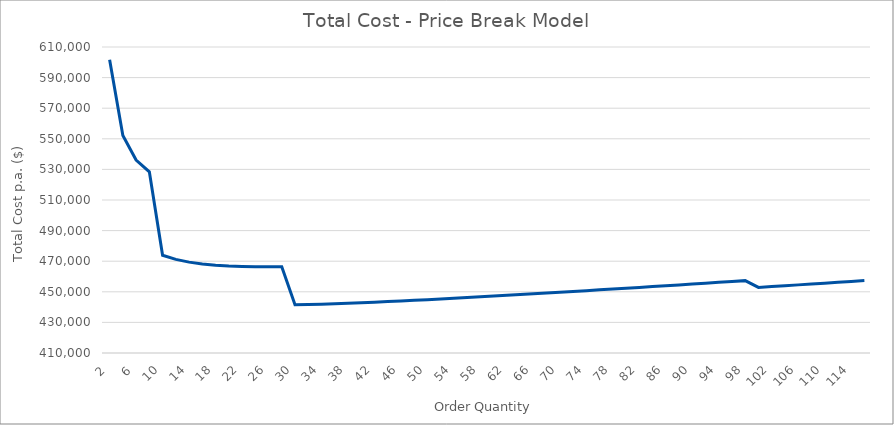
| Category | Series 0 |
|---|---|
| 2.0 | 601600 |
| 4.0 | 552200 |
| 6.0 | 536133.333 |
| 8.0 | 528400 |
| 10.0 | 473900 |
| 12.0 | 471166.667 |
| 14.0 | 469385.714 |
| 16.0 | 468200 |
| 18.0 | 467411.111 |
| 20.0 | 466900 |
| 22.0 | 466590.909 |
| 24.0 | 466433.333 |
| 26.0 | 466392.308 |
| 28.0 | 466442.857 |
| 30.0 | 441516.667 |
| 32.0 | 441700 |
| 34.0 | 441932.353 |
| 36.0 | 442205.556 |
| 38.0 | 442513.158 |
| 40.0 | 442850 |
| 42.0 | 443211.905 |
| 44.0 | 443595.455 |
| 46.0 | 443997.826 |
| 48.0 | 444416.667 |
| 50.0 | 444850 |
| 52.0 | 445296.154 |
| 54.0 | 445753.704 |
| 56.0 | 446221.429 |
| 58.0 | 446698.276 |
| 60.0 | 447183.333 |
| 62.0 | 447675.806 |
| 64.0 | 448175 |
| 66.0 | 448680.303 |
| 68.0 | 449191.176 |
| 70.0 | 449707.143 |
| 72.0 | 450227.778 |
| 74.0 | 450752.703 |
| 76.0 | 451281.579 |
| 78.0 | 451814.103 |
| 80.0 | 452350 |
| 82.0 | 452889.024 |
| 84.0 | 453430.952 |
| 86.0 | 453975.581 |
| 88.0 | 454522.727 |
| 90.0 | 455072.222 |
| 92.0 | 455623.913 |
| 94.0 | 456177.66 |
| 96.0 | 456733.333 |
| 98.0 | 457290.816 |
| 100.0 | 452840 |
| 102.0 | 453400.784 |
| 104.0 | 453963.077 |
| 106.0 | 454526.792 |
| 108.0 | 455091.852 |
| 110.0 | 455658.182 |
| 112.0 | 456225.714 |
| 114.0 | 456794.386 |
| 116.0 | 457364.138 |